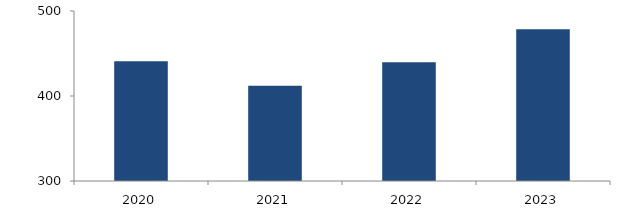
| Category | Bogotá |
|---|---|
| 2020.0 | 440.889 |
| 2021.0 | 412.099 |
| 2022.0 | 439.733 |
| 2023.0 | 478.485 |